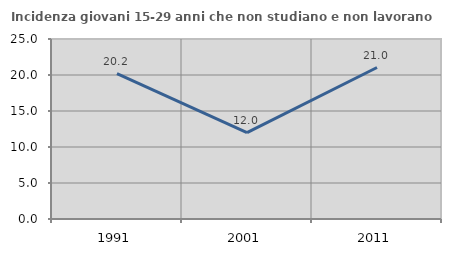
| Category | Incidenza giovani 15-29 anni che non studiano e non lavorano  |
|---|---|
| 1991.0 | 20.183 |
| 2001.0 | 11.987 |
| 2011.0 | 21.041 |